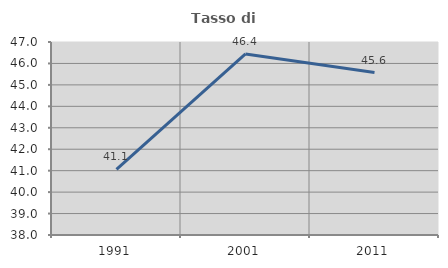
| Category | Tasso di occupazione   |
|---|---|
| 1991.0 | 41.059 |
| 2001.0 | 46.444 |
| 2011.0 | 45.575 |